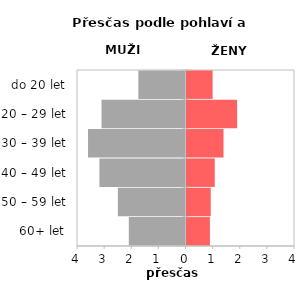
| Category | Přesčas |
|---|---|
| 60+ let | 0.864 |
| 50 – 59 let | 0.894 |
| 40 – 49 let | 1.042 |
| 30 – 39 let | 1.365 |
| 20 – 29 let | 1.865 |
| do 20 let | 0.963 |